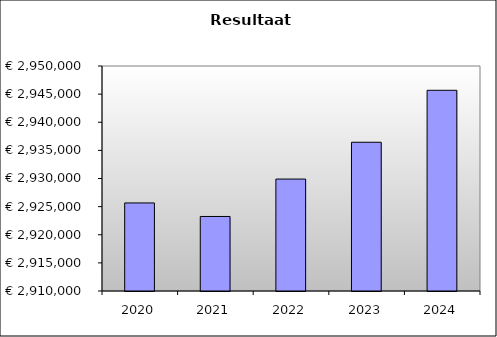
| Category | Series 0 |
|---|---|
| 2020.0 | 2925653.77 |
| 2021.0 | 2923249.838 |
| 2022.0 | 2929901.207 |
| 2023.0 | 2936442.177 |
| 2024.0 | 2945682.347 |